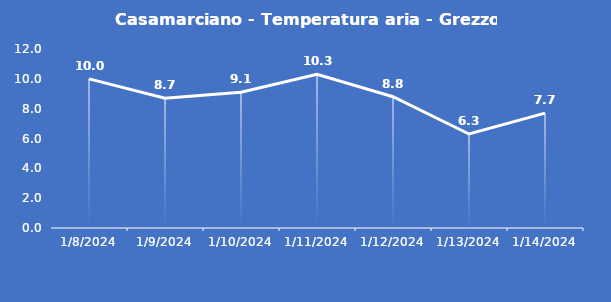
| Category | Casamarciano - Temperatura aria - Grezzo (°C) |
|---|---|
| 1/8/24 | 10 |
| 1/9/24 | 8.7 |
| 1/10/24 | 9.1 |
| 1/11/24 | 10.3 |
| 1/12/24 | 8.8 |
| 1/13/24 | 6.3 |
| 1/14/24 | 7.7 |